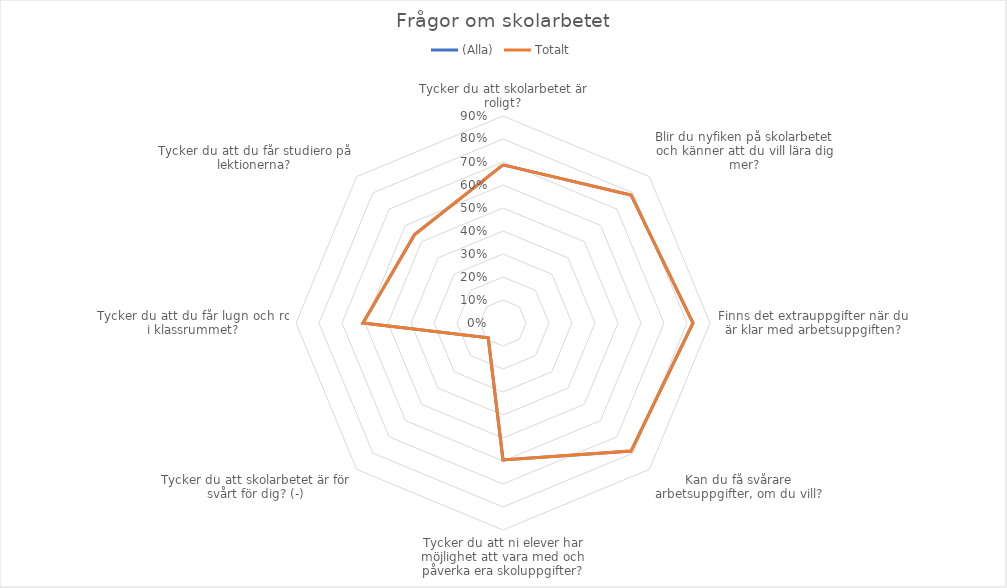
| Category | (Alla) | Totalt |
|---|---|---|
| Tycker du att skolarbetet är roligt? | 0.688 | 0.688 |
| Blir du nyfiken på skolarbetet och känner att du vill lära dig mer? | 0.787 | 0.787 |
| Finns det extrauppgifter när du är klar med arbetsuppgiften? | 0.826 | 0.826 |
| Kan du få svårare arbetsuppgifter, om du vill? | 0.787 | 0.787 |
| Tycker du att ni elever har möjlighet att vara med och påverka era skoluppgifter? | 0.596 | 0.596 |
| Tycker du att skolarbetet är för svårt för dig? (-) | 0.091 | 0.091 |
| Tycker du att du får lugn och ro i klassrummet? | 0.609 | 0.609 |
| Tycker du att du får studiero på lektionerna? | 0.543 | 0.543 |